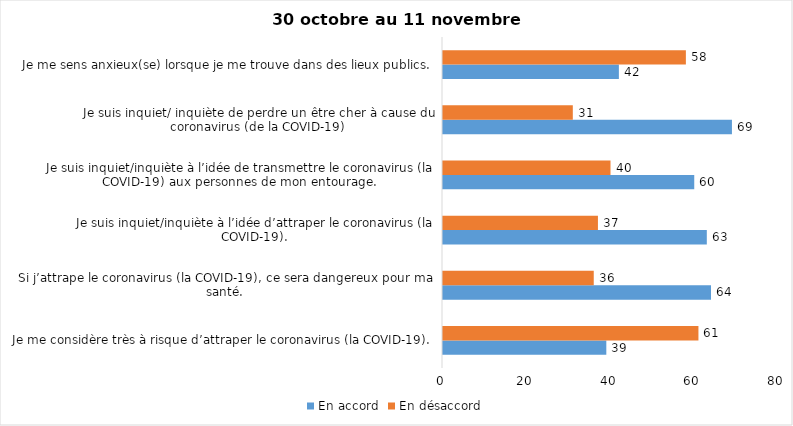
| Category | En accord | En désaccord |
|---|---|---|
| Je me considère très à risque d’attraper le coronavirus (la COVID-19). | 39 | 61 |
| Si j’attrape le coronavirus (la COVID-19), ce sera dangereux pour ma santé. | 64 | 36 |
| Je suis inquiet/inquiète à l’idée d’attraper le coronavirus (la COVID-19). | 63 | 37 |
| Je suis inquiet/inquiète à l’idée de transmettre le coronavirus (la COVID-19) aux personnes de mon entourage. | 60 | 40 |
| Je suis inquiet/ inquiète de perdre un être cher à cause du coronavirus (de la COVID-19) | 69 | 31 |
| Je me sens anxieux(se) lorsque je me trouve dans des lieux publics. | 42 | 58 |